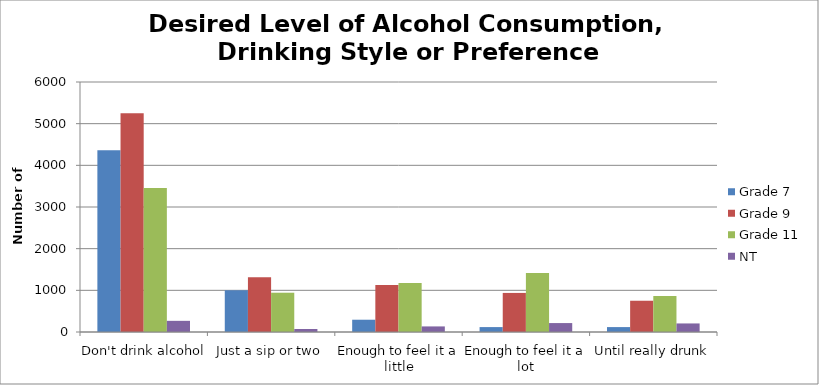
| Category | Grade 7 | Grade 9 | Grade 11 | NT |
|---|---|---|---|---|
| Don't drink alcohol | 4360.82 | 5252.24 | 3457.08 | 267.9 |
| Just a sip or two | 1001.81 | 1313.06 | 942.84 | 71.44 |
| Enough to feel it a little | 294.65 | 1125.48 | 1178.55 | 133.95 |
| Enough to feel it a lot | 117.86 | 937.9 | 1414.26 | 214.32 |
| Until really drunk | 117.86 | 750.32 | 864.27 | 205.39 |